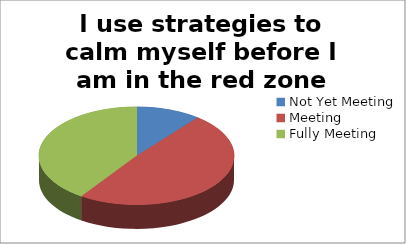
| Category | I use strategies to calm myself before I am in the red zone |
|---|---|
| Not Yet Meeting | 9 |
| Meeting | 41 |
| Fully Meeting | 34 |